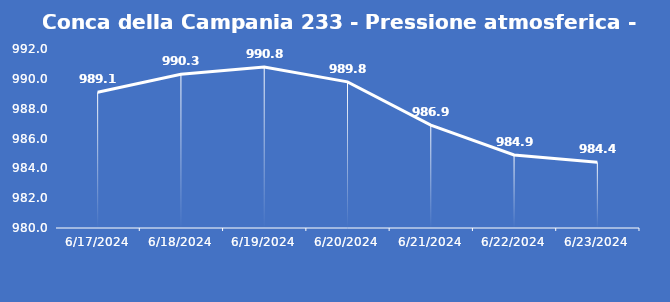
| Category | Conca della Campania 233 - Pressione atmosferica - Grezzo (hPa) |
|---|---|
| 6/17/24 | 989.1 |
| 6/18/24 | 990.3 |
| 6/19/24 | 990.8 |
| 6/20/24 | 989.8 |
| 6/21/24 | 986.9 |
| 6/22/24 | 984.9 |
| 6/23/24 | 984.4 |